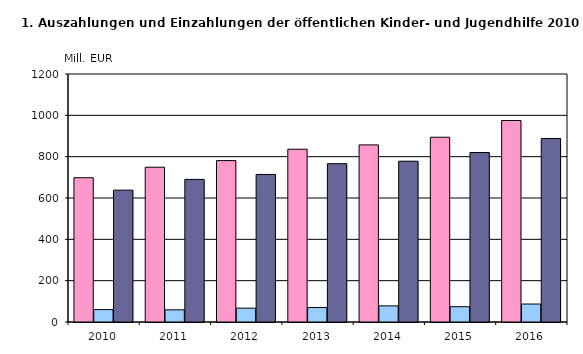
| Category | Ausgaben insgesamt | Einnahmen insgesamt | reine Ausgaben insgesamt |
|---|---|---|---|
| 2010.0 | 698 | 60 | 638 |
| 2011.0 | 749 | 59 | 690 |
| 2012.0 | 781 | 67 | 714 |
| 2013.0 | 836 | 70 | 766 |
| 2014.0 | 857 | 78 | 778 |
| 2015.0 | 894 | 74 | 820 |
| 2016.0 | 975 | 87 | 888 |